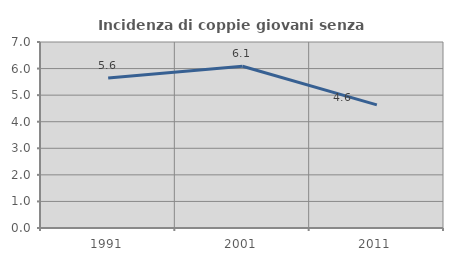
| Category | Incidenza di coppie giovani senza figli |
|---|---|
| 1991.0 | 5.647 |
| 2001.0 | 6.085 |
| 2011.0 | 4.632 |